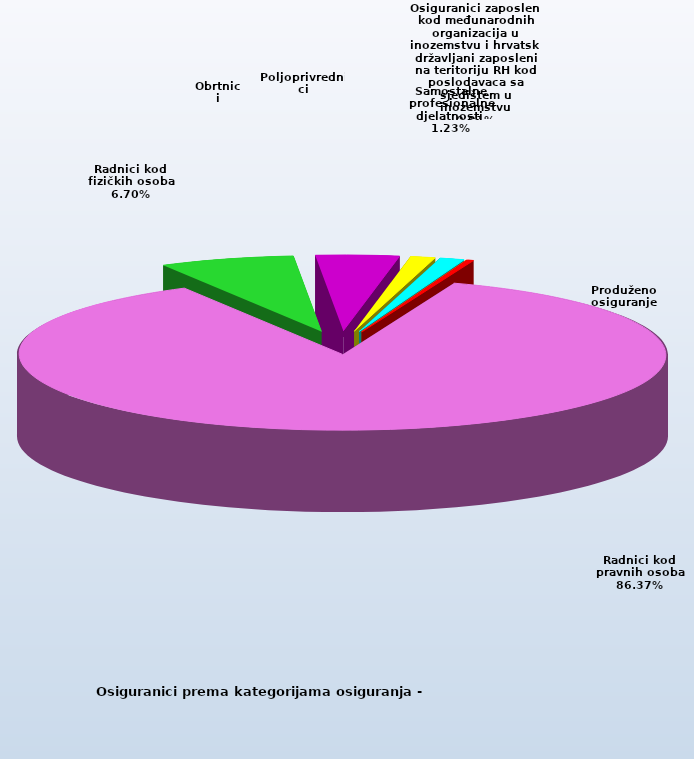
| Category | Series 0 |
|---|---|
| Radnici kod pravnih osoba | 1344608 |
| Radnici kod fizičkih osoba | 104325 |
| Obrtnici | 64492 |
| Poljoprivrednici | 19219 |
| Samostalne profesionalne djelatnosti  | 19091 |
| Osiguranici zaposleni kod međunarodnih organizacija u inozemstvu i hrvatski državljani zaposleni na teritoriju RH kod poslodavaca sa sjedištem u inozemstvu | 81 |
| Produženo osiguranje | 5010 |